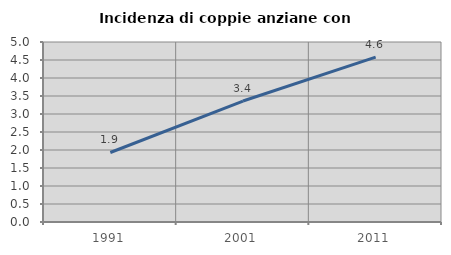
| Category | Incidenza di coppie anziane con figli |
|---|---|
| 1991.0 | 1.931 |
| 2001.0 | 3.36 |
| 2011.0 | 4.582 |